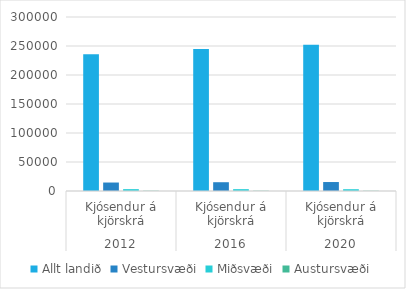
| Category | Allt landið | Vestursvæði | Miðsvæði | Austursvæði |
|---|---|---|---|---|
| 0 | 235743 | 14609 | 3223 | 402 |
| 1 | 244896 | 15141 | 3194 | 406 |
| 2 | 252152 | 15466 | 3099 | 376 |